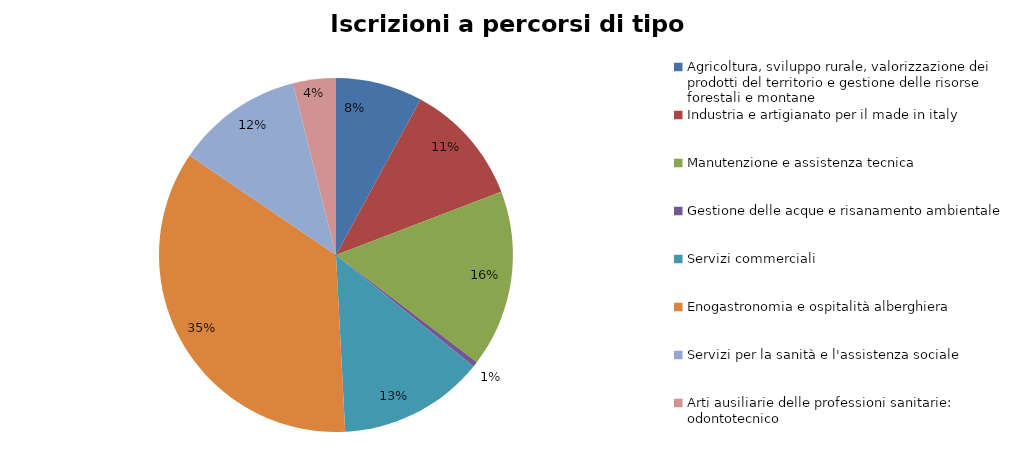
| Category | Series 0 |
|---|---|
| Agricoltura, sviluppo rurale, valorizzazione dei prodotti del territorio e gestione delle risorse forestali e montane | 345 |
| Industria e artigianato per il made in italy | 489 |
| Manutenzione e assistenza tecnica | 704 |
| Gestione delle acque e risanamento ambientale | 21 |
| Servizi commerciali | 580 |
| Enogastronomia e ospitalità alberghiera | 1537 |
| Servizi per la sanità e l'assistenza sociale | 504 |
| Arti ausiliarie delle professioni sanitarie: odontotecnico | 170 |